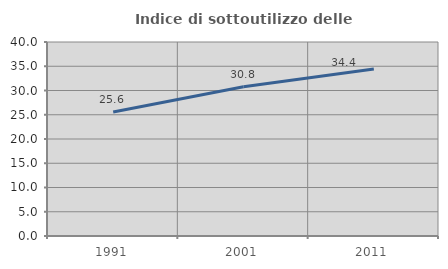
| Category | Indice di sottoutilizzo delle abitazioni  |
|---|---|
| 1991.0 | 25.581 |
| 2001.0 | 30.755 |
| 2011.0 | 34.433 |